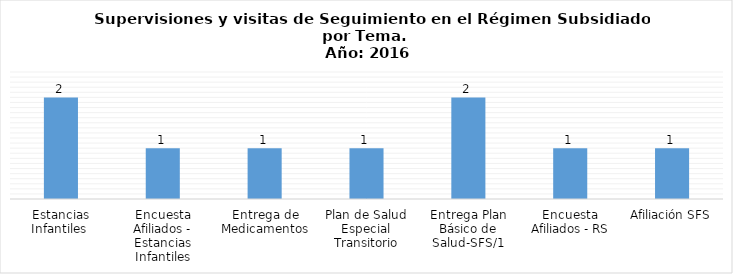
| Category | Total |
|---|---|
| Estancias Infantiles  | 2 |
| Encuesta Afiliados - Estancias Infantiles | 1 |
| Entrega de Medicamentos | 1 |
| Plan de Salud Especial Transitorio | 1 |
| Entrega Plan Básico de Salud-SFS/1 | 2 |
| Encuesta Afiliados - RS | 1 |
| Afiliación SFS | 1 |